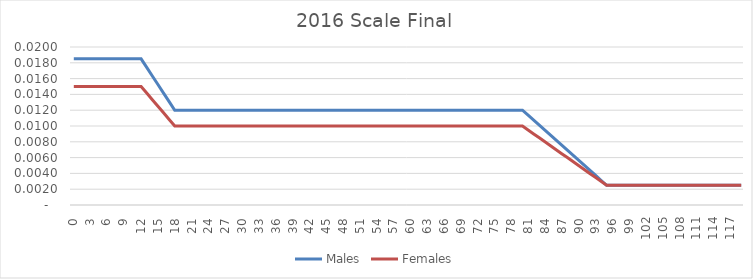
| Category | Males | Females |
|---|---|---|
| 0.0 | 0.018 | 0.015 |
| 1.0 | 0.018 | 0.015 |
| 2.0 | 0.018 | 0.015 |
| 3.0 | 0.018 | 0.015 |
| 4.0 | 0.018 | 0.015 |
| 5.0 | 0.018 | 0.015 |
| 6.0 | 0.018 | 0.015 |
| 7.0 | 0.018 | 0.015 |
| 8.0 | 0.018 | 0.015 |
| 9.0 | 0.018 | 0.015 |
| 10.0 | 0.018 | 0.015 |
| 11.0 | 0.018 | 0.015 |
| 12.0 | 0.018 | 0.015 |
| 13.0 | 0.017 | 0.014 |
| 14.0 | 0.016 | 0.013 |
| 15.0 | 0.015 | 0.012 |
| 16.0 | 0.014 | 0.012 |
| 17.0 | 0.013 | 0.011 |
| 18.0 | 0.012 | 0.01 |
| 19.0 | 0.012 | 0.01 |
| 20.0 | 0.012 | 0.01 |
| 21.0 | 0.012 | 0.01 |
| 22.0 | 0.012 | 0.01 |
| 23.0 | 0.012 | 0.01 |
| 24.0 | 0.012 | 0.01 |
| 25.0 | 0.012 | 0.01 |
| 26.0 | 0.012 | 0.01 |
| 27.0 | 0.012 | 0.01 |
| 28.0 | 0.012 | 0.01 |
| 29.0 | 0.012 | 0.01 |
| 30.0 | 0.012 | 0.01 |
| 31.0 | 0.012 | 0.01 |
| 32.0 | 0.012 | 0.01 |
| 33.0 | 0.012 | 0.01 |
| 34.0 | 0.012 | 0.01 |
| 35.0 | 0.012 | 0.01 |
| 36.0 | 0.012 | 0.01 |
| 37.0 | 0.012 | 0.01 |
| 38.0 | 0.012 | 0.01 |
| 39.0 | 0.012 | 0.01 |
| 40.0 | 0.012 | 0.01 |
| 41.0 | 0.012 | 0.01 |
| 42.0 | 0.012 | 0.01 |
| 43.0 | 0.012 | 0.01 |
| 44.0 | 0.012 | 0.01 |
| 45.0 | 0.012 | 0.01 |
| 46.0 | 0.012 | 0.01 |
| 47.0 | 0.012 | 0.01 |
| 48.0 | 0.012 | 0.01 |
| 49.0 | 0.012 | 0.01 |
| 50.0 | 0.012 | 0.01 |
| 51.0 | 0.012 | 0.01 |
| 52.0 | 0.012 | 0.01 |
| 53.0 | 0.012 | 0.01 |
| 54.0 | 0.012 | 0.01 |
| 55.0 | 0.012 | 0.01 |
| 56.0 | 0.012 | 0.01 |
| 57.0 | 0.012 | 0.01 |
| 58.0 | 0.012 | 0.01 |
| 59.0 | 0.012 | 0.01 |
| 60.0 | 0.012 | 0.01 |
| 61.0 | 0.012 | 0.01 |
| 62.0 | 0.012 | 0.01 |
| 63.0 | 0.012 | 0.01 |
| 64.0 | 0.012 | 0.01 |
| 65.0 | 0.012 | 0.01 |
| 66.0 | 0.012 | 0.01 |
| 67.0 | 0.012 | 0.01 |
| 68.0 | 0.012 | 0.01 |
| 69.0 | 0.012 | 0.01 |
| 70.0 | 0.012 | 0.01 |
| 71.0 | 0.012 | 0.01 |
| 72.0 | 0.012 | 0.01 |
| 73.0 | 0.012 | 0.01 |
| 74.0 | 0.012 | 0.01 |
| 75.0 | 0.012 | 0.01 |
| 76.0 | 0.012 | 0.01 |
| 77.0 | 0.012 | 0.01 |
| 78.0 | 0.012 | 0.01 |
| 79.0 | 0.012 | 0.01 |
| 80.0 | 0.012 | 0.01 |
| 81.0 | 0.011 | 0.01 |
| 82.0 | 0.011 | 0.009 |
| 83.0 | 0.01 | 0.008 |
| 84.0 | 0.009 | 0.008 |
| 85.0 | 0.009 | 0.007 |
| 86.0 | 0.008 | 0.007 |
| 87.0 | 0.008 | 0.006 |
| 88.0 | 0.007 | 0.006 |
| 89.0 | 0.006 | 0.005 |
| 90.0 | 0.006 | 0.005 |
| 91.0 | 0.005 | 0.004 |
| 92.0 | 0.004 | 0.004 |
| 93.0 | 0.004 | 0.003 |
| 94.0 | 0.003 | 0.003 |
| 95.0 | 0.002 | 0.002 |
| 96.0 | 0.002 | 0.002 |
| 97.0 | 0.002 | 0.002 |
| 98.0 | 0.002 | 0.002 |
| 99.0 | 0.002 | 0.002 |
| 100.0 | 0.002 | 0.002 |
| 101.0 | 0.002 | 0.002 |
| 102.0 | 0.002 | 0.002 |
| 103.0 | 0.002 | 0.002 |
| 104.0 | 0.002 | 0.002 |
| 105.0 | 0.002 | 0.002 |
| 106.0 | 0.002 | 0.002 |
| 107.0 | 0.002 | 0.002 |
| 108.0 | 0.002 | 0.002 |
| 109.0 | 0.002 | 0.002 |
| 110.0 | 0.002 | 0.002 |
| 111.0 | 0.002 | 0.002 |
| 112.0 | 0.002 | 0.002 |
| 113.0 | 0.002 | 0.002 |
| 114.0 | 0.002 | 0.002 |
| 115.0 | 0.002 | 0.002 |
| 116.0 | 0.002 | 0.002 |
| 117.0 | 0.002 | 0.002 |
| 118.0 | 0.002 | 0.002 |
| 119.0 | 0.002 | 0.002 |